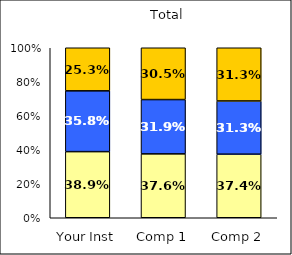
| Category | Low Respect | Average Respect | High Respect |
|---|---|---|---|
| Your Inst | 0.389 | 0.358 | 0.253 |
| Comp 1 | 0.376 | 0.319 | 0.305 |
| Comp 2 | 0.374 | 0.313 | 0.313 |